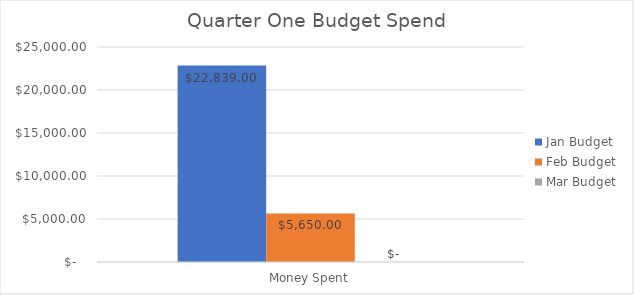
| Category | Jan Budget | Feb Budget | Mar Budget |
|---|---|---|---|
| 0 | 22839 | 5650 | 0 |